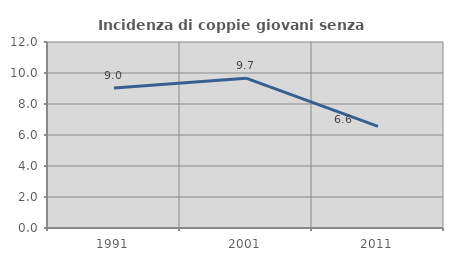
| Category | Incidenza di coppie giovani senza figli |
|---|---|
| 1991.0 | 9.031 |
| 2001.0 | 9.667 |
| 2011.0 | 6.557 |